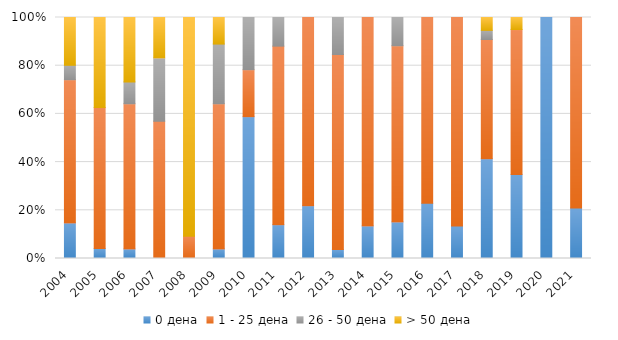
| Category | 0 дена | 1 - 25 дена | 26 - 50 дена | > 50 дена |
|---|---|---|---|---|
| 2004.0 | 14.778 | 59.389 | 6.005 | 19.828 |
| 2005.0 | 4.151 | 58.522 | 0 | 37.327 |
| 2006.0 | 3.983 | 60.202 | 9.052 | 26.763 |
| 2007.0 | 0 | 56.983 | 26.226 | 16.79 |
| 2008.0 | 0 | 4.151 | 0 | 40.611 |
| 2009.0 | 3.983 | 60.202 | 24.787 | 11.029 |
| 2010.0 | 58.837 | 19.478 | 21.685 | 0 |
| 2011.0 | 14.046 | 74.069 | 11.885 | 0 |
| 2012.0 | 21.902 | 78.098 | 0 | 0 |
| 2013.0 | 3.711 | 80.94 | 15.349 | 0 |
| 2014.0 | 13.525 | 86.475 | 0 | 0 |
| 2015.0 | 15.185 | 73.071 | 11.744 | 0 |
| 2016.0 | 22.874 | 77.126 | 0 | 0 |
| 2017.0 | 13.44 | 86.56 | 0 | 0 |
| 2018.0 | 41.369 | 49.507 | 3.784 | 5.34 |
| 2019.0 | 34.852 | 60.141 | 0 | 5.006 |
| 2020.0 | 100 | 0 | 0 | 0 |
| 2021.0 | 20.908 | 79.092 | 0 | 0 |